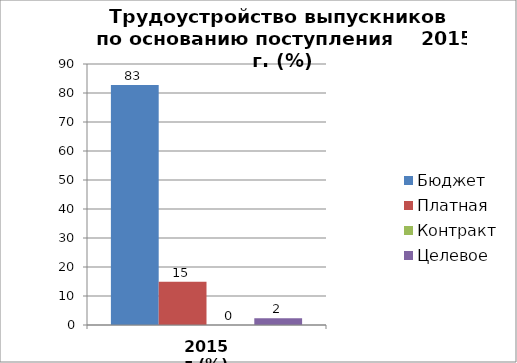
| Category | Бюджет | Платная | Контракт | Целевое |
|---|---|---|---|---|
| 2015 г.(%) | 82.759 | 14.943 | 0 | 2.299 |